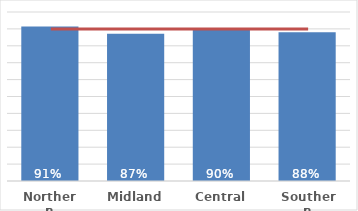
| Category | Dep 5 |
|---|---|
| Northern | 0.915 |
| Midland | 0.871 |
| Central | 0.899 |
| Southern | 0.88 |